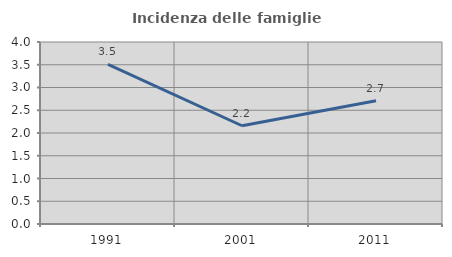
| Category | Incidenza delle famiglie numerose |
|---|---|
| 1991.0 | 3.509 |
| 2001.0 | 2.159 |
| 2011.0 | 2.71 |